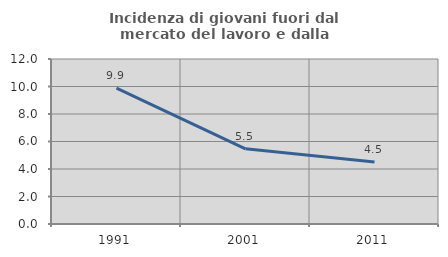
| Category | Incidenza di giovani fuori dal mercato del lavoro e dalla formazione  |
|---|---|
| 1991.0 | 9.884 |
| 2001.0 | 5.469 |
| 2011.0 | 4.505 |